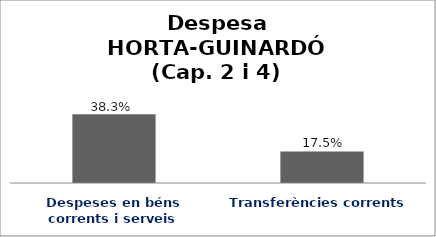
| Category | Series 0 |
|---|---|
| Despeses en béns corrents i serveis | 0.383 |
| Transferències corrents | 0.175 |